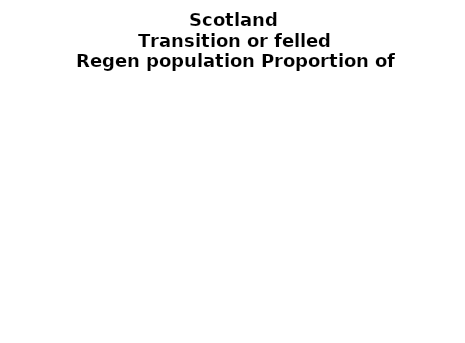
| Category | Transition or felled |
|---|---|
| None | 0.136 |
| Seedlings only | 0 |
| Seedlings, saplings only | 0.124 |
| Seedlings, saplings, <7 cm trees | 0.085 |
| Saplings only | 0.407 |
| <7 cm trees, seedlings only | 0 |
| <7 cm trees, saplings only | 0.208 |
| <7 cm Trees only | 0.04 |